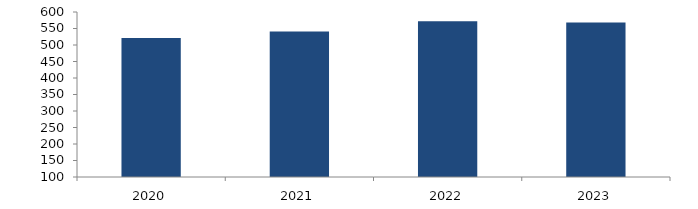
| Category | Bogotá |
|---|---|
| 2020.0 | 521.44 |
| 2021.0 | 540.969 |
| 2022.0 | 572.02 |
| 2023.0 | 568.513 |